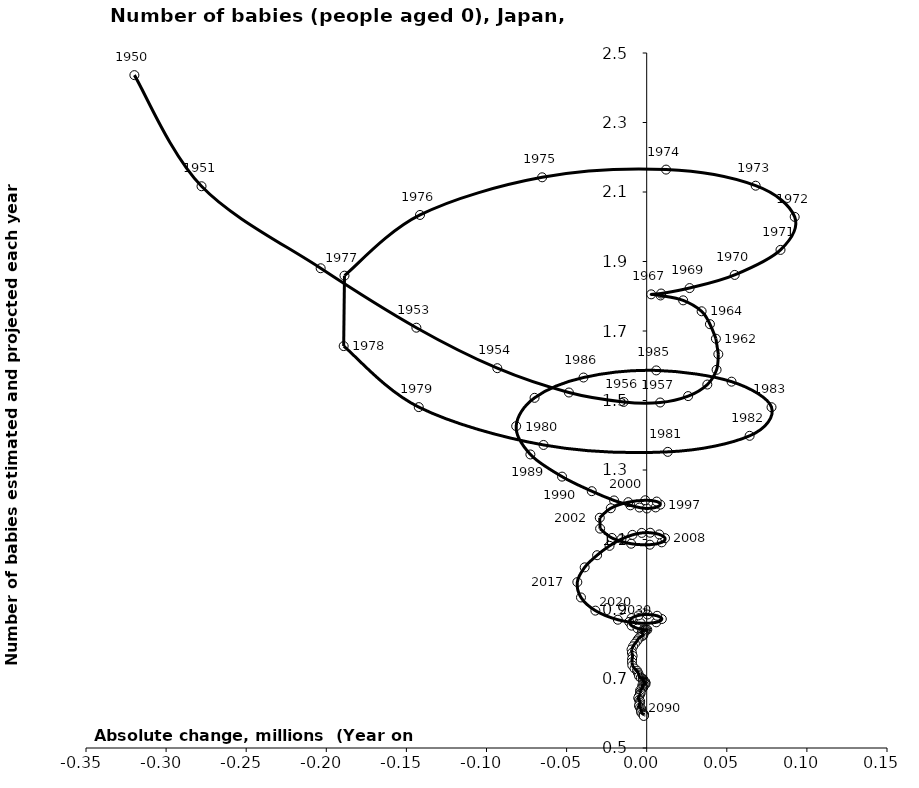
| Category | Series 0 |
|---|---|
| -0.319798 | 2.436 |
| -0.27788750000000007 | 2.117 |
| -0.20351550000000007 | 1.881 |
| -0.14377050000000002 | 1.71 |
| -0.09325400000000006 | 1.593 |
| -0.048554500000000056 | 1.523 |
| -0.014383499999999994 | 1.496 |
| 0.008393500000000054 | 1.494 |
| 0.025865499999999986 | 1.513 |
| 0.03784200000000004 | 1.546 |
| 0.04362850000000007 | 1.588 |
| 0.04470899999999989 | 1.633 |
| 0.043200499999999975 | 1.678 |
| 0.03947450000000008 | 1.72 |
| 0.034288500000000055 | 1.757 |
| 0.02274750000000003 | 1.788 |
| 0.00865399999999994 | 1.802 |
| 0.002790999999999988 | 1.805 |
| 0.009007499999999946 | 1.808 |
| 0.026775499999999952 | 1.824 |
| 0.05493150000000002 | 1.861 |
| 0.08352249999999994 | 1.933 |
| 0.09238249999999992 | 2.028 |
| 0.06802100000000011 | 2.118 |
| 0.012084500000000276 | 2.164 |
| -0.06526549999999998 | 2.142 |
| -0.14151400000000025 | 2.034 |
| -0.1886500000000001 | 1.859 |
| -0.1891504999999999 | 1.657 |
| -0.14227849999999997 | 1.481 |
| -0.06440049999999997 | 1.372 |
| 0.01315350000000004 | 1.352 |
| 0.06424450000000004 | 1.398 |
| 0.07791799999999993 | 1.481 |
| 0.0529639999999999 | 1.554 |
| 0.00595750000000006 | 1.587 |
| -0.03945600000000005 | 1.566 |
| -0.06999149999999998 | 1.508 |
| -0.08147749999999998 | 1.426 |
| -0.07260350000000004 | 1.345 |
| -0.052841499999999986 | 1.281 |
| -0.034289000000000014 | 1.239 |
| -0.020372999999999974 | 1.212 |
| -0.010198999999999958 | 1.198 |
| -0.004518499999999981 | 1.192 |
| 0.00014999999999998348 | 1.189 |
| 0.005575999999999914 | 1.192 |
| 0.008485999999999994 | 1.2 |
| 0.0062309999999999865 | 1.209 |
| -0.0008989999999999831 | 1.213 |
| -0.011490499999999959 | 1.207 |
| -0.022421499999999983 | 1.19 |
| -0.029296499999999948 | 1.163 |
| -0.02908300000000008 | 1.131 |
| -0.02172800000000008 | 1.104 |
| -0.009692499999999993 | 1.088 |
| 0.001967500000000122 | 1.085 |
| 0.009372500000000117 | 1.092 |
| 0.011434500000000014 | 1.104 |
| 0.007854499999999875 | 1.115 |
| 0.00216649999999996 | 1.119 |
| -0.0031120000000000037 | 1.119 |
| -0.00889899999999999 | 1.113 |
| -0.015760999999999914 | 1.101 |
| -0.023195000000000077 | 1.082 |
| -0.03095950000000003 | 1.055 |
| -0.03871599999999997 | 1.02 |
| -0.04330200000000001 | 0.977 |
| -0.04102149999999999 | 0.933 |
| -0.032033000000000034 | 0.895 |
| -0.018015499999999962 | 0.869 |
| -0.003767999999999938 | 0.859 |
| 0.0059454999999999925 | 0.862 |
| 0.009446500000000024 | 0.871 |
| 0.006487999999999994 | 0.881 |
| 0.0005809999999999427 | 0.884 |
| -0.005139999999999978 | 0.882 |
| -0.009400999999999993 | 0.874 |
| -0.010886500000000021 | 0.863 |
| -0.009423000000000015 | 0.852 |
| -0.0056795000000000595 | 0.844 |
| -0.0020990000000000175 | 0.841 |
| -0.00023299999999998322 | 0.84 |
| 0.0003815000000000346 | 0.84 |
| -0.00030999999999997696 | 0.841 |
| -0.0008965000000000223 | 0.84 |
| -0.0013264999999999527 | 0.839 |
| -0.0021859999999999657 | 0.837 |
| -0.00279000000000007 | 0.834 |
| -0.0031120000000000037 | 0.831 |
| -0.002603499999999981 | 0.828 |
| -0.002012999999999987 | 0.826 |
| -0.0022599999999999842 | 0.824 |
| -0.0030300000000000327 | 0.822 |
| -0.004445500000000047 | 0.818 |
| -0.005437000000000025 | 0.813 |
| -0.006153499999999923 | 0.807 |
| -0.007360499999999992 | 0.801 |
| -0.008510500000000032 | 0.793 |
| -0.009452499999999975 | 0.783 |
| -0.0092275 | 0.774 |
| -0.008797500000000014 | 0.765 |
| -0.009110000000000007 | 0.756 |
| -0.009178999999999993 | 0.747 |
| -0.008976499999999998 | 0.738 |
| -0.007591000000000014 | 0.729 |
| -0.006052000000000002 | 0.722 |
| -0.005454499999999973 | 0.717 |
| -0.004992500000000011 | 0.712 |
| -0.0047579999999999845 | 0.707 |
| -0.0036940000000000306 | 0.702 |
| -0.002476500000000048 | 0.699 |
| -0.002178499999999972 | 0.697 |
| -0.0021094999999999864 | 0.695 |
| -0.0022520000000000318 | 0.693 |
| -0.001657500000000034 | 0.691 |
| -0.0008869999999999711 | 0.69 |
| -0.0008189999999999586 | 0.689 |
| -0.0009449999999999736 | 0.688 |
| -0.0014700000000000268 | 0.687 |
| -0.0012564999999999937 | 0.685 |
| -0.0007309999999999817 | 0.684 |
| -0.0011214999999999975 | 0.684 |
| -0.001881500000000036 | 0.682 |
| -0.0027674999999999783 | 0.68 |
| -0.0025589999999999224 | 0.677 |
| -0.0021535000000000304 | 0.675 |
| -0.002680999999999989 | 0.672 |
| -0.003314000000000039 | 0.669 |
| -0.00410550000000004 | 0.666 |
| -0.004043999999999992 | 0.661 |
| -0.0037764999999999604 | 0.658 |
| -0.00426749999999998 | 0.654 |
| -0.004778500000000019 | 0.649 |
| -0.005286500000000027 | 0.644 |
| -0.004795500000000008 | 0.638 |
| -0.004105499999999929 | 0.634 |
| -0.004264500000000004 | 0.63 |
| -0.004507000000000039 | 0.626 |
| -0.004801500000000014 | 0.621 |
| -0.004170499999999966 | 0.616 |
| -0.0033644999999999925 | 0.613 |
| -0.0033395000000000508 | 0.61 |
| -0.0033620000000000316 | 0.606 |
| -0.0034814999999999707 | 0.603 |
| -0.002750999999999948 | 0.599 |
| -0.0018139999999999823 | 0.597 |
| -0.0016614999999999824 | 0.596 |
| -0.0016790000000000416 | 0.594 |
| -0.0018670000000000075 | 0.592 |